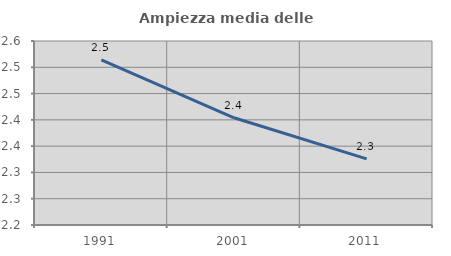
| Category | Ampiezza media delle famiglie |
|---|---|
| 1991.0 | 2.514 |
| 2001.0 | 2.404 |
| 2011.0 | 2.326 |